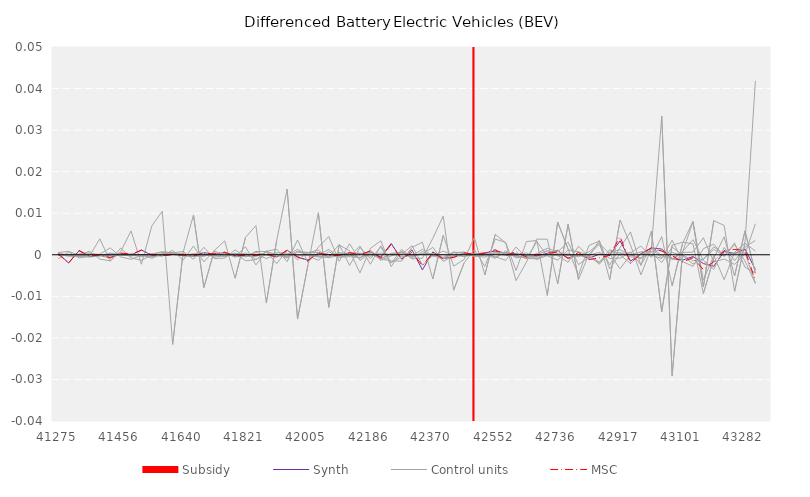
| Category | Subsidy |
|---|---|
| 0 | 0 |
| 1 | 0 |
| 2 | 0 |
| 3 | 0 |
| 4 | 0 |
| 5 | 0 |
| 6 | 0 |
| 7 | 0 |
| 8 | 0 |
| 9 | 0 |
| 10 | 0 |
| 11 | 0 |
| 12 | 0 |
| 13 | 0 |
| 14 | 0 |
| 15 | 0 |
| 16 | 0 |
| 17 | 0 |
| 18 | 0 |
| 19 | 0 |
| 20 | 0 |
| 21 | 0 |
| 22 | 0 |
| 23 | 0 |
| 24 | 0 |
| 25 | 0 |
| 26 | 0 |
| 27 | 0 |
| 28 | 0 |
| 29 | 0 |
| 30 | 0 |
| 31 | 0 |
| 32 | 0 |
| 33 | 0 |
| 34 | 0 |
| 35 | 0 |
| 36 | 0 |
| 37 | 0 |
| 38 | 0 |
| 39 | 0 |
| 40 | 1.5 |
| 41 | 0 |
| 42 | 0 |
| 43 | 0 |
| 44 | 0 |
| 45 | 0 |
| 46 | 0 |
| 47 | 0 |
| 48 | 0 |
| 49 | 0 |
| 50 | 0 |
| 51 | 0 |
| 52 | 0 |
| 53 | 0 |
| 54 | 0 |
| 55 | 0 |
| 56 | 0 |
| 57 | 0 |
| 58 | 0 |
| 59 | 0 |
| 60 | 0 |
| 61 | 0 |
| 62 | 0 |
| 63 | 0 |
| 64 | 0 |
| 65 | 0 |
| 66 | 0 |
| 67 | 0 |
| 68 | 0 |